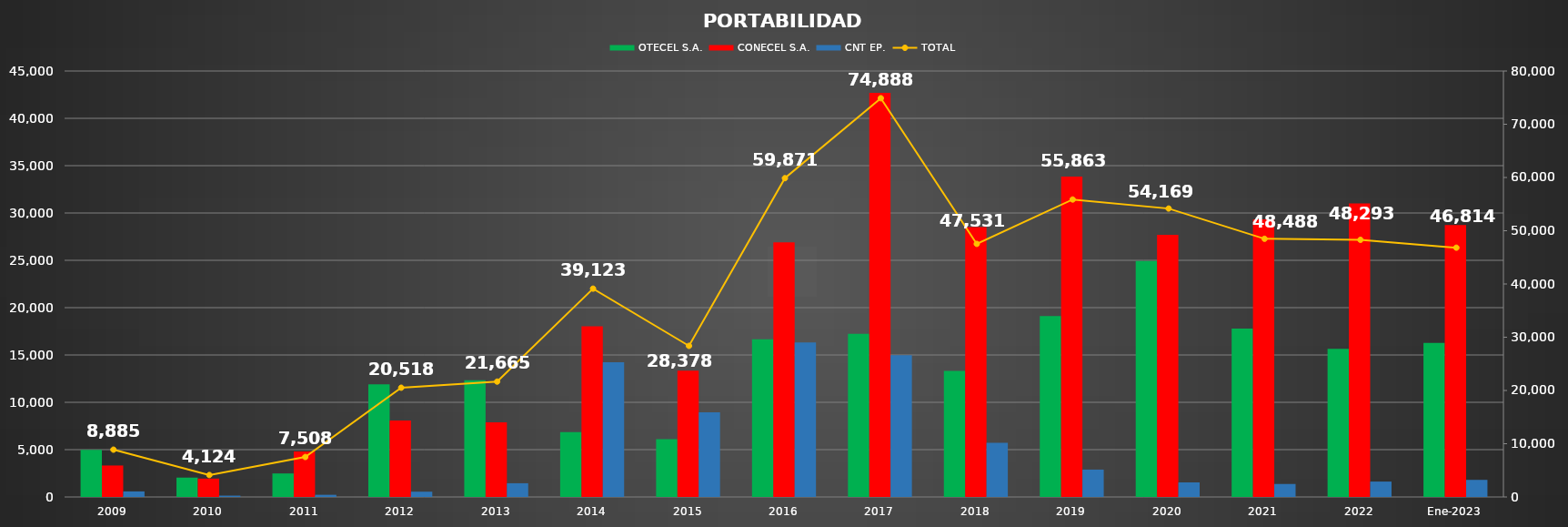
| Category | OTECEL S.A. | CONECEL S.A. | CNT EP. |
|---|---|---|---|
| 2009 | 4973 | 3324 | 588 |
| 2010 | 2045 | 1939 | 140 |
| 2011 | 2484 | 4796 | 228 |
| 2012 | 11894 | 8067 | 557 |
| 2013 | 12323 | 7893 | 1449 |
| 2014 | 6853 | 18039 | 14231 |
| 2015 | 6105 | 13334 | 8939 |
| 2016 | 16653 | 26907 | 16311 |
| 2017 | 17228 | 42694 | 14966 |
| 2018 | 13309 | 28504 | 5718 |
| 2019 | 19116 | 33857 | 2890 |
| 2020 | 24933 | 27700 | 1536 |
| 2021 | 17795 | 29321 | 1372 |
| 2022 | 15655 | 31012 | 1626 |
| Ene-2023 | 16278 | 28730 | 1806 |